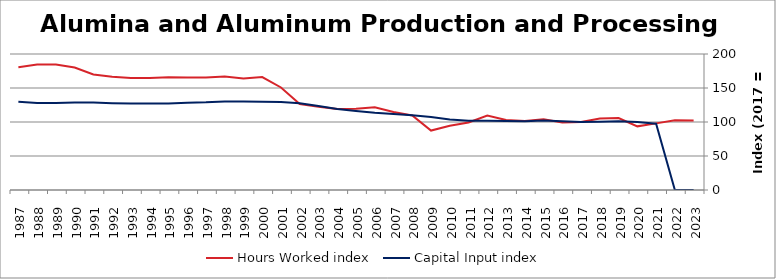
| Category | Hours Worked index | Capital Input index |
|---|---|---|
| 2023.0 | 102.157 | 0 |
| 2022.0 | 102.401 | 0 |
| 2021.0 | 97.965 | 97.406 |
| 2020.0 | 93.61 | 100.138 |
| 2019.0 | 105.817 | 101.154 |
| 2018.0 | 105.25 | 100.408 |
| 2017.0 | 100 | 100 |
| 2016.0 | 99.188 | 101.118 |
| 2015.0 | 103.907 | 102.027 |
| 2014.0 | 101.465 | 101.178 |
| 2013.0 | 102.871 | 101.31 |
| 2012.0 | 109.362 | 101.789 |
| 2011.0 | 99.227 | 101.914 |
| 2010.0 | 94.553 | 103.595 |
| 2009.0 | 87.433 | 107.47 |
| 2008.0 | 109.687 | 109.795 |
| 2007.0 | 114.74 | 111.787 |
| 2006.0 | 121.704 | 113.456 |
| 2005.0 | 119.599 | 116.236 |
| 2004.0 | 119.091 | 119.255 |
| 2003.0 | 122.29 | 123.491 |
| 2002.0 | 126.517 | 127.502 |
| 2001.0 | 150.739 | 129.316 |
| 2000.0 | 166.081 | 129.777 |
| 1999.0 | 164.069 | 130.293 |
| 1998.0 | 166.95 | 130.166 |
| 1997.0 | 165.314 | 128.885 |
| 1996.0 | 165.572 | 128.226 |
| 1995.0 | 165.836 | 127.167 |
| 1994.0 | 164.814 | 127.232 |
| 1993.0 | 164.612 | 127.144 |
| 1992.0 | 166.452 | 127.645 |
| 1991.0 | 169.773 | 128.75 |
| 1990.0 | 180.072 | 128.611 |
| 1989.0 | 184.714 | 127.842 |
| 1988.0 | 184.588 | 127.881 |
| 1987.0 | 180.68 | 129.627 |